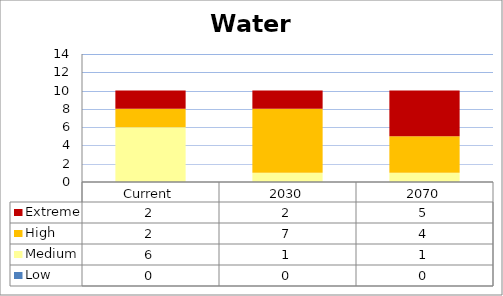
| Category | Low | Medium | High | Extreme |
|---|---|---|---|---|
| Current | 0 | 6 | 2 | 2 |
| 2030 | 0 | 1 | 7 | 2 |
| 2070 | 0 | 1 | 4 | 5 |